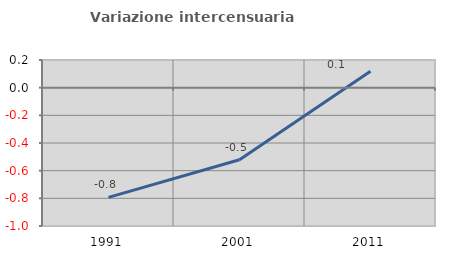
| Category | Variazione intercensuaria annua |
|---|---|
| 1991.0 | -0.793 |
| 2001.0 | -0.521 |
| 2011.0 | 0.118 |